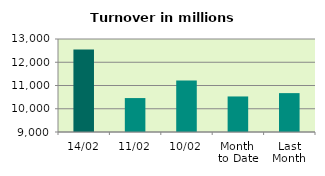
| Category | Series 0 |
|---|---|
| 14/02 | 12544.674 |
| 11/02 | 10459.617 |
| 10/02 | 11212.599 |
| Month 
to Date | 10528.802 |
| Last
Month | 10672.471 |